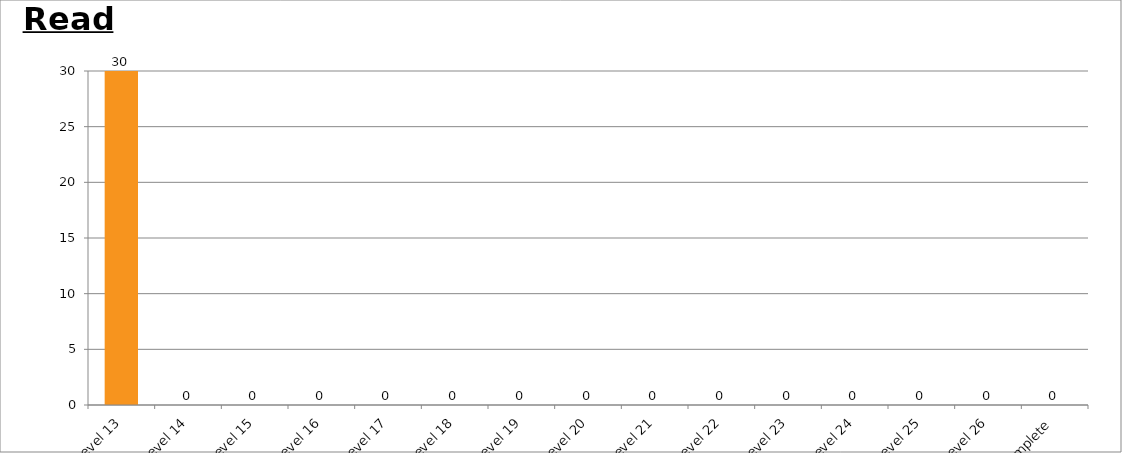
| Category | Series 0 |
|---|---|
| Level 13 | 30 |
| Level 14 | 0 |
| Level 15 | 0 |
| Level 16 | 0 |
| Level 17 | 0 |
| Level 18 | 0 |
| Level 19 | 0 |
| Level 20 | 0 |
| Level 21 | 0 |
| Level 22 | 0 |
| Level 23 | 0 |
| Level 24 | 0 |
| Level 25 | 0 |
| Level 26 | 0 |
| Complete | 0 |